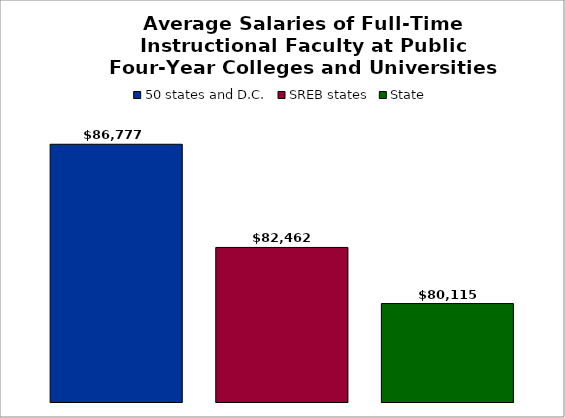
| Category | 50 states and D.C. | SREB states | State |
|---|---|---|---|
| 0 | 86776.755 | 82462.191 | 80115.259 |